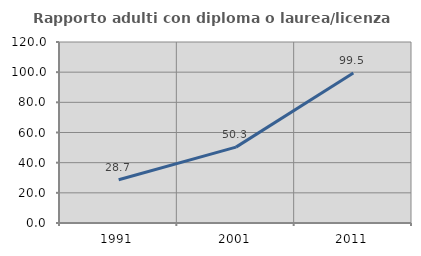
| Category | Rapporto adulti con diploma o laurea/licenza media  |
|---|---|
| 1991.0 | 28.701 |
| 2001.0 | 50.308 |
| 2011.0 | 99.496 |